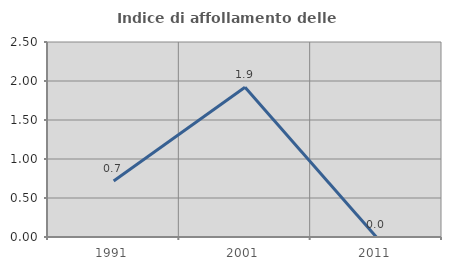
| Category | Indice di affollamento delle abitazioni  |
|---|---|
| 1991.0 | 0.718 |
| 2001.0 | 1.919 |
| 2011.0 | 0 |